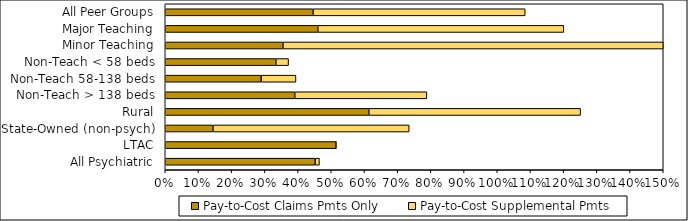
| Category | Pay-to-Cost Claims Pmts Only | Pay-to-Cost Supplemental Pmts |
|---|---|---|
| All Peer Groups | 0.445 | 0.639 |
| Major Teaching | 0.459 | 0.741 |
| Minor Teaching | 0.354 | 2.262 |
| Non-Teach < 58 beds | 0.333 | 0.038 |
| Non-Teach 58-138 beds | 0.289 | 0.105 |
| Non-Teach > 138 beds | 0.39 | 0.398 |
| Rural | 0.613 | 0.638 |
| State-Owned (non-psych) | 0.144 | 0.591 |
| LTAC | 0.514 | 0 |
| All Psychiatric | 0.452 | 0.013 |